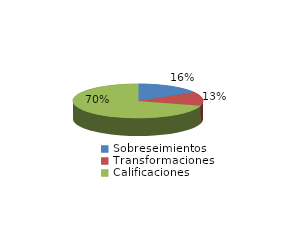
| Category | Series 0 |
|---|---|
| Sobreseimientos | 764 |
| Transformaciones | 611 |
| Calificaciones | 3273 |